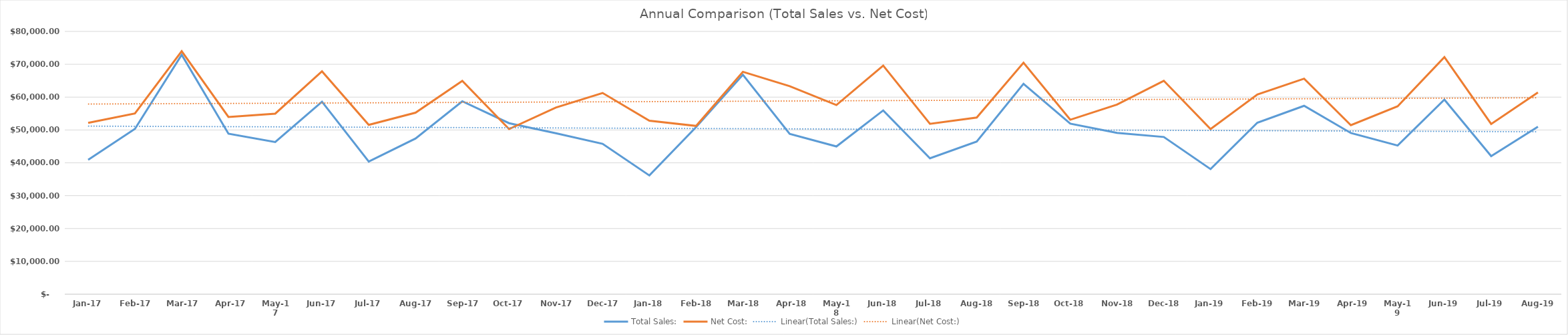
| Category | Total Sales: | Net Cost: |
|---|---|---|
| 2017-01-01 | 40907.5 | 52180 |
| 2017-02-01 | 50335.71 | 55032.87 |
| 2017-03-01 | 72895.97 | 73982.64 |
| 2017-04-01 | 48874.97 | 53959.27 |
| 2017-05-01 | 46336.01 | 54967.18 |
| 2017-06-01 | 58598.06 | 67853.8 |
| 2017-07-01 | 40381.17 | 51543.41 |
| 2017-08-01 | 47398.6 | 55262.93 |
| 2017-09-01 | 58728.13 | 64958.87 |
| 2017-10-01 | 52071.79 | 50272.74 |
| 2017-11-01 | 49010.19 | 56822.89 |
| 2017-12-01 | 45791.46 | 61256.86 |
| 2018-01-01 | 36151.66 | 52833.74 |
| 2018-02-01 | 50886.2 | 51236.09 |
| 2018-03-01 | 66797.72 | 67713.42 |
| 2018-04-01 | 48836.07 | 63320.51 |
| 2018-05-01 | 44986.82 | 57591.91 |
| 2018-06-01 | 55945.07 | 69585.82 |
| 2018-07-01 | 41379.64 | 51880.52 |
| 2018-08-01 | 46483.38 | 53785.89 |
| 2018-09-01 | 64053.19 | 70484.84 |
| 2018-10-01 | 51938.32 | 53117.82 |
| 2018-11-01 | 49106.87 | 57746.94 |
| 2018-12-01 | 47866.58 | 64973.08 |
| 2019-01-01 | 38087.11 | 50295.99 |
| 2019-02-01 | 52214.52 | 60785.54 |
| 2019-03-01 | 57358.9 | 65616.92 |
| 2019-04-01 | 49068.61 | 51455.03 |
| 2019-05-01 | 45265.57 | 57206.09 |
| 2019-06-01 | 59243.69 | 72184.67 |
| 2019-07-01 | 42046.74 | 51831.66 |
| 2019-08-01 | 50978.33 | 61420.93 |